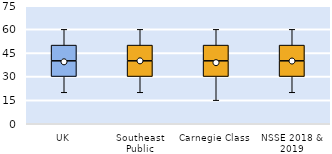
| Category | 25th | 50th | 75th |
|---|---|---|---|
| UK | 30 | 10 | 10 |
| Southeast Public | 30 | 10 | 10 |
| Carnegie Class | 30 | 10 | 10 |
| NSSE 2018 & 2019 | 30 | 10 | 10 |